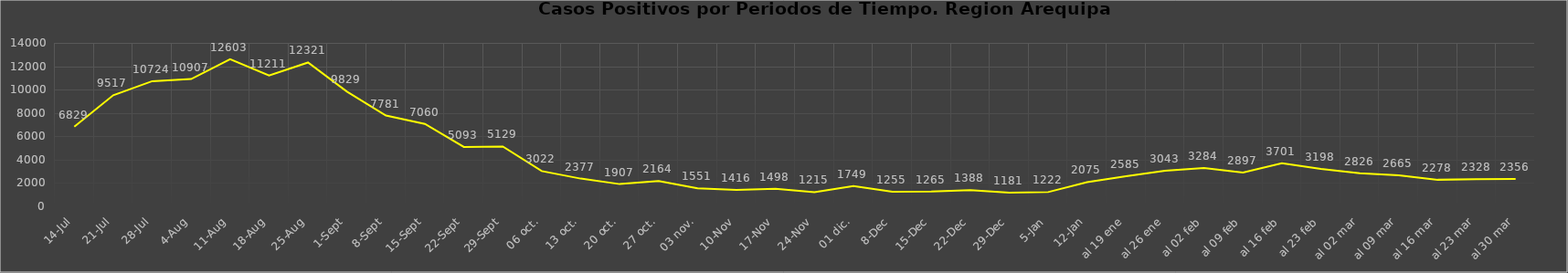
| Category | Series 2 |
|---|---|
| 14-Jul | 6829 |
| 21-Jul | 9517 |
| 28-Jul | 10724 |
| 4-Ago | 10907 |
| 11-Ago | 12603 |
| 18-Ago | 11211 |
| 25-Ago | 12321 |
| 1-Set | 9829 |
| 8-Set | 7781 |
| 15-Set | 7060 |
| 22-Set | 5093 |
| 29-Set | 5129 |
| 06 oct. | 3022 |
| 13 oct. | 2377 |
| 20 oct. | 1907 |
| 27 oct. | 2164 |
| 03 nov. | 1551 |
| 10-Nov | 1416 |
| 17-Nov | 1498 |
| 24-Nov | 1215 |
|  01 dic. | 1749 |
| 8-Dic | 1255 |
| 15-Dic | 1265 |
| 22-Dic | 1388 |
| 29-Dic | 1181 |
| 5-Ene | 1222 |
| 12-Ene | 2075 |
| al 19 ene | 2585 |
| al 26 ene | 3043 |
| al 02 feb | 3284 |
| al 09 feb | 2897 |
| al 16 feb | 3701 |
| al 23 feb | 3198 |
| al 02 mar | 2826 |
| al 09 mar | 2665 |
| al 16 mar | 2278 |
| al 23 mar | 2328 |
| al 30 mar | 2356 |